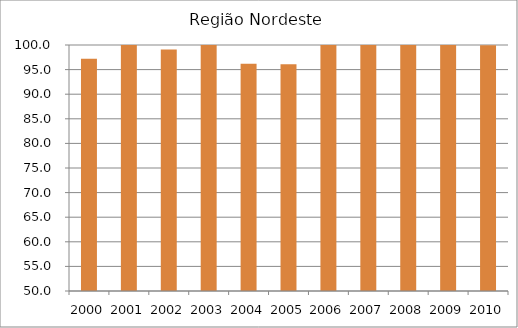
| Category | Região Nordeste |
|---|---|
| 2000.0 | 97.2 |
| 2001.0 | 103.7 |
| 2002.0 | 99.1 |
| 2003.0 | 100 |
| 2004.0 | 96.2 |
| 2005.0 | 96.1 |
| 2006.0 | 106 |
| 2007.0 | 108.3 |
| 2008.0 | 102.4 |
| 2009.0 | 103 |
| 2010.0 | 99.97 |